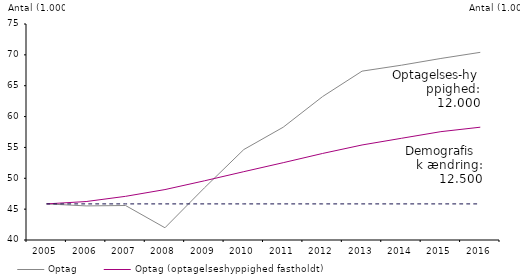
| Category | Optag | Optag (optagelseshyppighed fastholdt) | Optag 2005 |
|---|---|---|---|
| 2005.0 | 45849 | 45849 |  |
| 2006.0 | 45524 | 46233 |  |
| 2007.0 | 45588 | 47074 |  |
| 2008.0 | 41983 | 48171 |  |
| 2009.0 | 48446 | 49589 |  |
| 2010.0 | 54655 | 51073 |  |
| 2011.0 | 58277 | 52530 |  |
| 2012.0 | 63247 | 54025 |  |
| 2013.0 | 67360 | 55398 |  |
| 2014.0 | 68325 | 56480 |  |
| 2015.0 | 69417 | 57557 |  |
| 2016.0 | 70409 | 58278 |  |